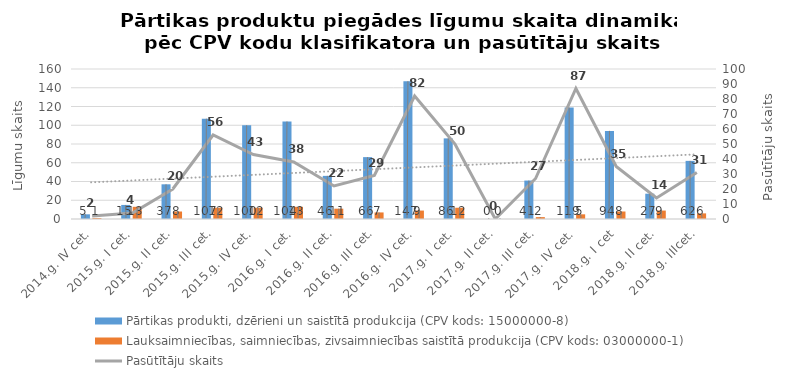
| Category | Pārtikas produkti, dzērieni un saistītā produkcija (CPV kods: 15000000-8) | Lauksaimniecības, saimniecības, zivsaimniecības saistītā produkcija (CPV kods: 03000000-1) |
|---|---|---|
| 2014.g. IV cet. | 5 | 1 |
| 2015.g. I cet. | 15 | 13 |
| 2015.g. II cet. | 37 | 8 |
| 2015.g. III cet. | 107 | 12 |
| 2015.g. IV cet. | 100 | 12 |
| 2016.g. I cet. | 104 | 13 |
| 2016.g. II cet. | 46 | 11 |
| 2016.g. III cet. | 66 | 7 |
| 2016.g. IV cet. | 147 | 9 |
| 2017.g. I cet. | 86 | 12 |
| 2017.g. II cet. | 0 | 0 |
| 2017.g. III cet. | 41 | 2 |
| 2017.g. IV cet. | 119 | 5 |
| 2018.g. I cet | 94 | 8 |
| 2018.g. II cet. | 27 | 9 |
| 2018.g. IIIcet. | 62 | 6 |